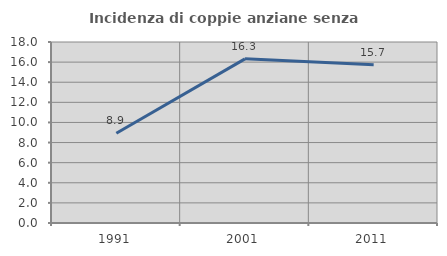
| Category | Incidenza di coppie anziane senza figli  |
|---|---|
| 1991.0 | 8.929 |
| 2001.0 | 16.327 |
| 2011.0 | 15.745 |